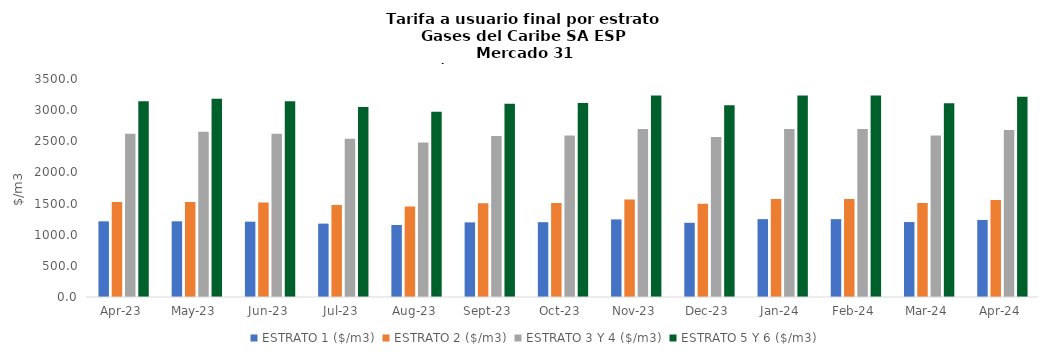
| Category | ESTRATO 1 ($/m3) | ESTRATO 2 ($/m3) | ESTRATO 3 Y 4 ($/m3) | ESTRATO 5 Y 6 ($/m3) |
|---|---|---|---|---|
| 2023-04-01 | 1215.25 | 1524.46 | 2619.03 | 3142.836 |
| 2023-05-01 | 1215.25 | 1524.46 | 2651.33 | 3181.596 |
| 2023-06-01 | 1209.41 | 1517.12 | 2619.03 | 3142.836 |
| 2023-07-01 | 1178 | 1477.97 | 2542.18 | 3050.616 |
| 2023-08-01 | 1155.93 | 1451.92 | 2479.28 | 2975.136 |
| 2023-09-01 | 1198 | 1503.27 | 2586.8 | 3104.16 |
| 2023-10-01 | 1201.13 | 1507.69 | 2594.42 | 3113.304 |
| 2023-11-01 | 1245.69 | 1564.66 | 2697.24 | 3236.688 |
| 2023-12-01 | 1191.7 | 1497.74 | 2567.03 | 3080.436 |
| 2024-01-01 | 1250.09 | 1571.48 | 2695.95 | 3235.14 |
| 2024-02-01 | 1250.09 | 1571.48 | 2695.95 | 3235.14 |
| 2024-03-01 | 1203.3 | 1510.97 | 2592.3 | 3110.76 |
| 2024-04-01 | 1237.07 | 1556.63 | 2680.45 | 3216.54 |